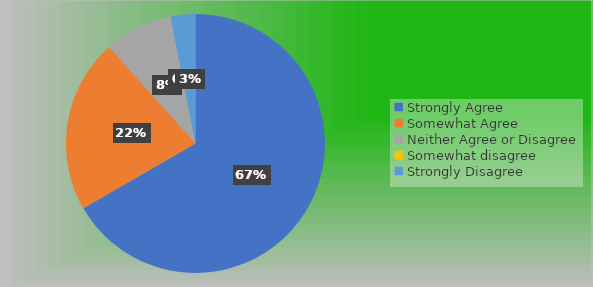
| Category | Series 0 |
|---|---|
| Strongly Agree | 86 |
| Somewhat Agree | 28 |
| Neither Agree or Disagree | 11 |
| Somewhat disagree | 0 |
| Strongly Disagree | 4 |